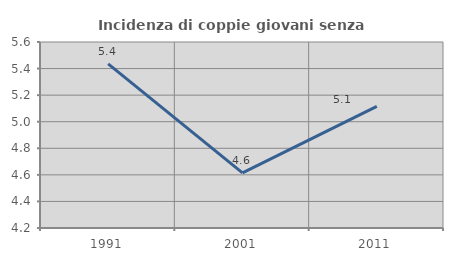
| Category | Incidenza di coppie giovani senza figli |
|---|---|
| 1991.0 | 5.435 |
| 2001.0 | 4.615 |
| 2011.0 | 5.115 |